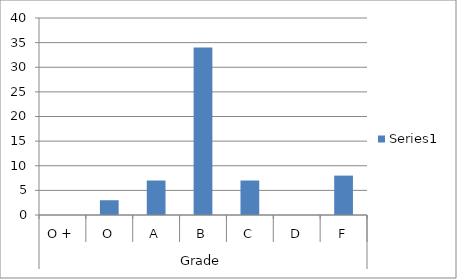
| Category | Series 0 |
|---|---|
| 0 | 0 |
| 1 | 3 |
| 2 | 7 |
| 3 | 34 |
| 4 | 7 |
| 5 | 0 |
| 6 | 8 |